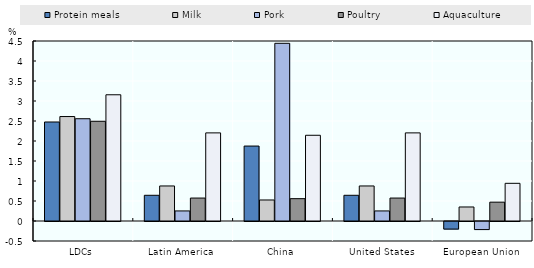
| Category | Protein meals | Milk | Pork | Poultry | Aquaculture |
|---|---|---|---|---|---|
| LDCs | 2.475 | 2.612 | 2.557 | 2.493 | 3.156 |
| Latin America | 0.643 | 0.876 | 0.252 | 0.574 | 2.203 |
| China | 1.874 | 0.526 | 4.442 | 0.559 | 2.143 |
| United States | 0.643 | 0.876 | 0.252 | 0.574 | 2.203 |
| European Union | -0.19 | 0.35 | -0.202 | 0.471 | 0.942 |